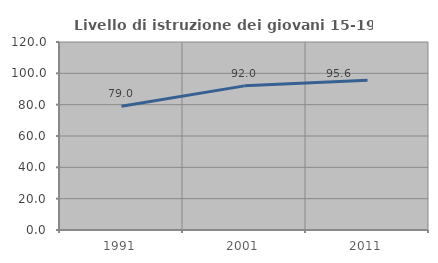
| Category | Livello di istruzione dei giovani 15-19 anni |
|---|---|
| 1991.0 | 78.972 |
| 2001.0 | 92.002 |
| 2011.0 | 95.621 |